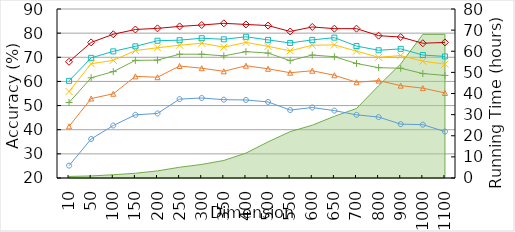
| Category | Top 1 | Top 2 | Top 3 | Top 4 | Top 5 | Top 10 |
|---|---|---|---|---|---|---|
| 10.0 | 25.116 | 41.395 | 51.279 | 55.814 | 60.233 | 68.14 |
| 50.0 | 36.163 | 52.907 | 61.512 | 67.326 | 69.767 | 76.163 |
| 100.0 | 41.744 | 54.884 | 64.07 | 68.721 | 72.442 | 79.535 |
| 150.0 | 46.163 | 62.093 | 68.721 | 72.791 | 74.535 | 81.512 |
| 200.0 | 46.744 | 61.744 | 68.837 | 73.953 | 76.86 | 81.977 |
| 250.0 | 52.674 | 66.395 | 71.279 | 75 | 77.093 | 82.791 |
| 300.0 | 53.14 | 65.465 | 71.279 | 75.814 | 77.907 | 83.372 |
| 350.0 | 52.442 | 64.186 | 70.581 | 74.186 | 77.442 | 84.07 |
| 400.0 | 52.326 | 66.512 | 72.326 | 76.163 | 78.488 | 83.605 |
| 500.0 | 51.512 | 65.233 | 71.744 | 74.535 | 77.209 | 83.14 |
| 550.0 | 48.14 | 63.605 | 68.605 | 72.674 | 75.93 | 80.698 |
| 600.0 | 49.186 | 64.419 | 70.93 | 75 | 77.209 | 82.558 |
| 650.0 | 47.907 | 62.558 | 70.233 | 75.116 | 78.14 | 81.86 |
| 700.0 | 46.163 | 59.651 | 67.442 | 72.558 | 74.651 | 81.86 |
| 800.0 | 45.233 | 60.349 | 65.698 | 70 | 72.907 | 78.953 |
| 900.0 | 42.326 | 58.256 | 65.465 | 70.698 | 73.488 | 78.372 |
| 1000.0 | 42.093 | 57.209 | 63.256 | 68.372 | 70.93 | 75.814 |
| 1100.0 | 39.244 | 55.233 | 62.5 | 67.151 | 70.349 | 76.163 |